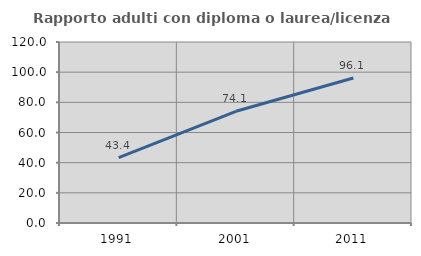
| Category | Rapporto adulti con diploma o laurea/licenza media  |
|---|---|
| 1991.0 | 43.363 |
| 2001.0 | 74.074 |
| 2011.0 | 96.108 |